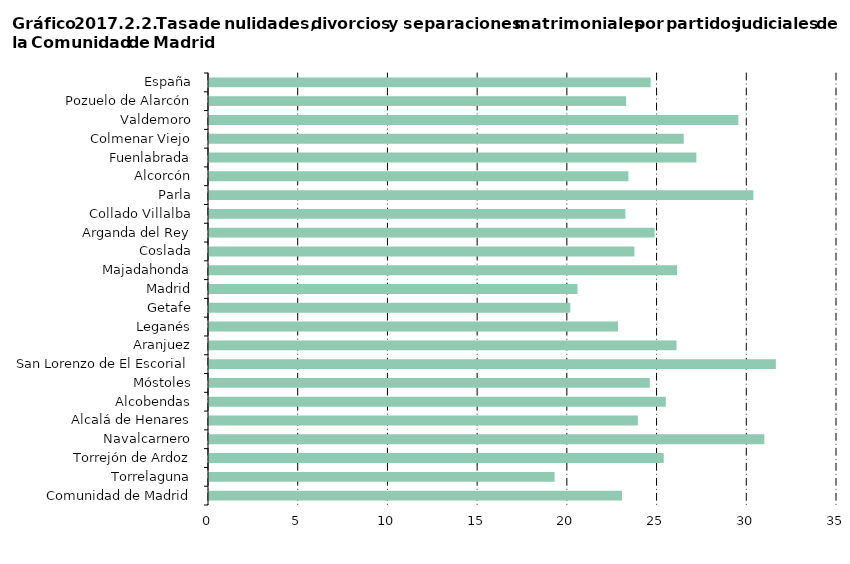
| Category | Series 0 |
|---|---|
| Comunidad de Madrid | 23.015 |
|     Torrelaguna | 19.259 |
|     Torrejón de Ardoz | 25.343 |
|     Navalcarnero | 30.951 |
|     Alcalá de Henares | 23.902 |
|     Alcobendas | 25.457 |
|     Móstoles | 24.567 |
|     San Lorenzo de El Escorial | 31.591 |
|     Aranjuez | 26.056 |
|     Leganés | 22.8 |
|     Getafe | 20.136 |
|     Madrid | 20.537 |
|     Majadahonda | 26.086 |
|     Coslada | 23.708 |
|     Arganda del Rey | 24.837 |
|     Collado Villalba | 23.206 |
|     Parla | 30.339 |
|     Alcorcón | 23.373 |
|     Fuenlabrada | 27.161 |
|     Colmenar Viejo | 26.459 |
|     Valdemoro | 29.503 |
|     Pozuelo de Alarcón | 23.246 |
| España | 24.614 |